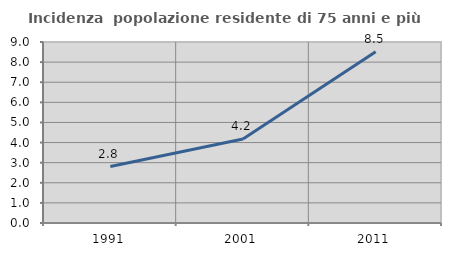
| Category | Incidenza  popolazione residente di 75 anni e più |
|---|---|
| 1991.0 | 2.809 |
| 2001.0 | 4.177 |
| 2011.0 | 8.516 |